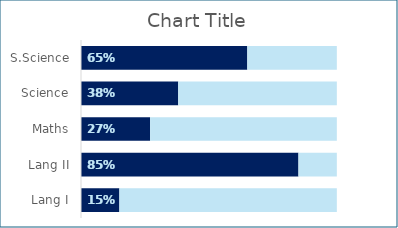
| Category | Marks | Percent |
|---|---|---|
| Lang I | 0.15 | 0.85 |
| Lang II | 0.85 | 0.15 |
| Maths | 0.27 | 0.73 |
| Science | 0.38 | 0.62 |
| S.Science | 0.65 | 0.35 |